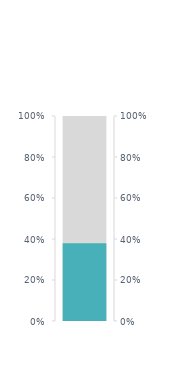
| Category | Cieľová hmotnosť |
|---|---|
| 0 | 13.2 |